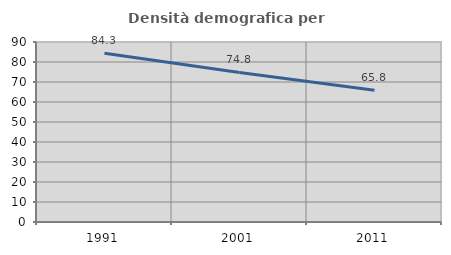
| Category | Densità demografica |
|---|---|
| 1991.0 | 84.345 |
| 2001.0 | 74.755 |
| 2011.0 | 65.828 |